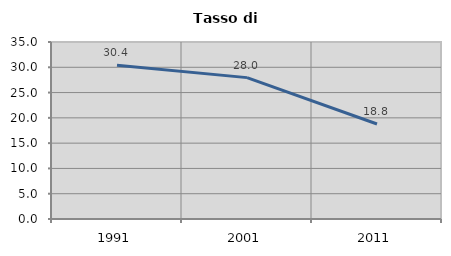
| Category | Tasso di disoccupazione   |
|---|---|
| 1991.0 | 30.384 |
| 2001.0 | 27.955 |
| 2011.0 | 18.792 |